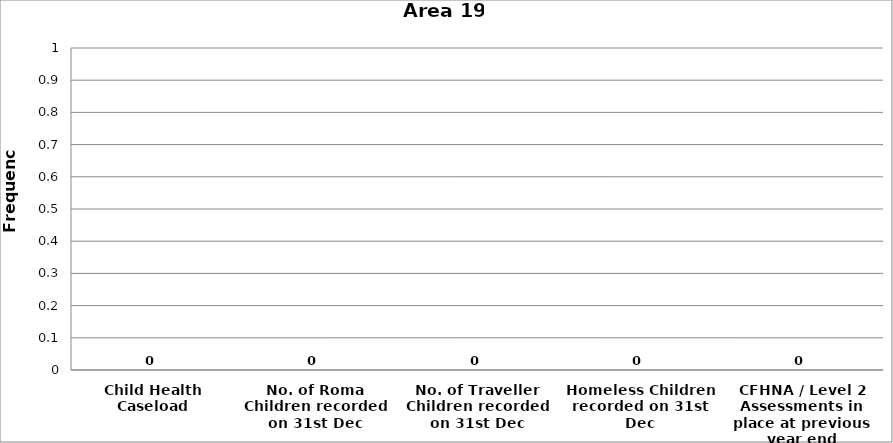
| Category | Area 19 |
|---|---|
| Child Health Caseload | 0 |
| No. of Roma Children recorded on 31st Dec | 0 |
| No. of Traveller Children recorded on 31st Dec | 0 |
| Homeless Children recorded on 31st Dec | 0 |
| CFHNA / Level 2 Assessments in place at previous year end | 0 |